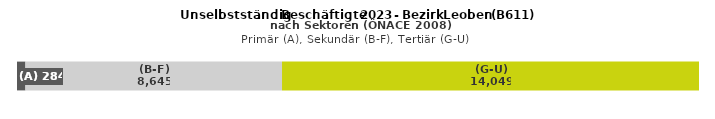
| Category | (A) | (B-F) | (G-U) |
|---|---|---|---|
| 0 | 284 | 8645 | 14049 |